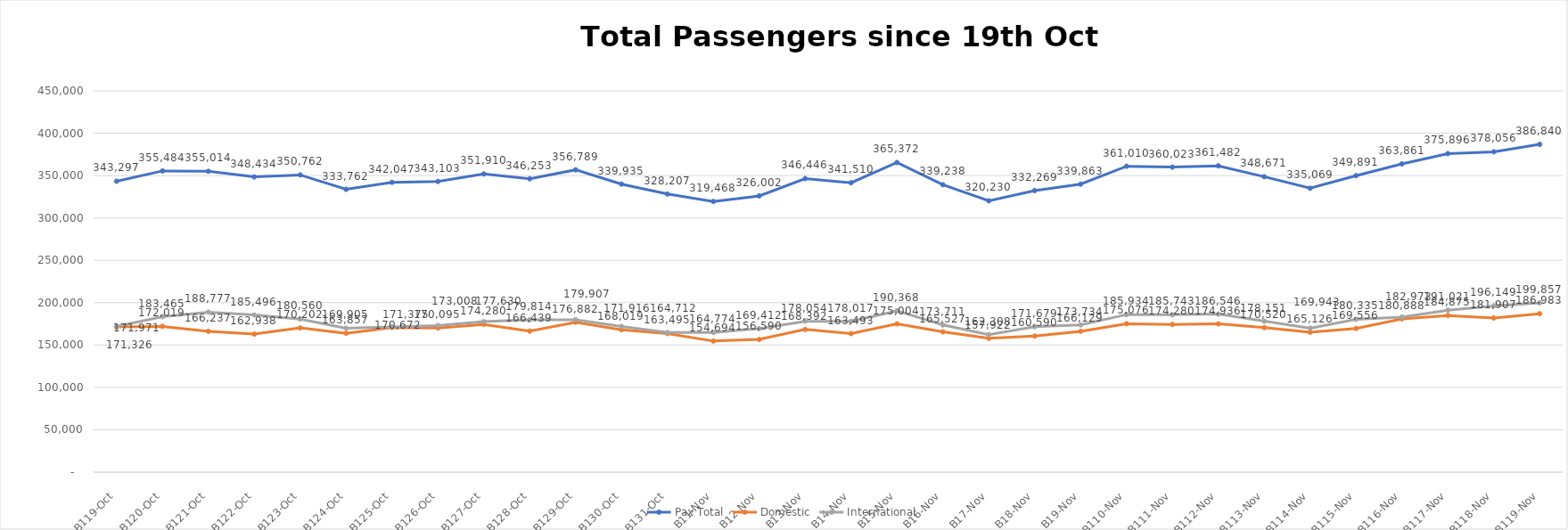
| Category | Pax Total | Domestic | International |
|---|---|---|---|
| 2023-10-19 | 343297 | 171326 | 171971 |
| 2023-10-20 | 355484 | 172019 | 183465 |
| 2023-10-21 | 355014 | 166237 | 188777 |
| 2023-10-22 | 348434 | 162938 | 185496 |
| 2023-10-23 | 350762 | 170202 | 180560 |
| 2023-10-24 | 333762 | 163857 | 169905 |
| 2023-10-25 | 342047 | 170672 | 171375 |
| 2023-10-26 | 343103 | 170095 | 173008 |
| 2023-10-27 | 351910 | 174280 | 177630 |
| 2023-10-28 | 346253 | 166439 | 179814 |
| 2023-10-29 | 356789 | 176882 | 179907 |
| 2023-10-30 | 339935 | 168019 | 171916 |
| 2023-10-31 | 328207 | 163495 | 164712 |
| 2023-11-01 | 319468 | 154694 | 164774 |
| 2023-11-02 | 326002 | 156590 | 169412 |
| 2023-11-03 | 346446 | 168392 | 178054 |
| 2023-11-04 | 341510 | 163493 | 178017 |
| 2023-11-05 | 365372 | 175004 | 190368 |
| 2023-11-06 | 339238 | 165527 | 173711 |
| 2023-11-07 | 320230 | 157922 | 162308 |
| 2023-11-08 | 332269 | 160590 | 171679 |
| 2023-11-09 | 339863 | 166129 | 173734 |
| 2023-11-10 | 361010 | 175076 | 185934 |
| 2023-11-11 | 360023 | 174280 | 185743 |
| 2023-11-12 | 361482 | 174936 | 186546 |
| 2023-11-13 | 348671 | 170520 | 178151 |
| 2023-11-14 | 335069 | 165126 | 169943 |
| 2023-11-15 | 349891 | 169556 | 180335 |
| 2023-11-16 | 363861 | 180888 | 182973 |
| 2023-11-17 | 375896 | 184875 | 191021 |
| 2023-11-18 | 378056 | 181907 | 196149 |
| 2023-11-19 | 386840 | 186983 | 199857 |